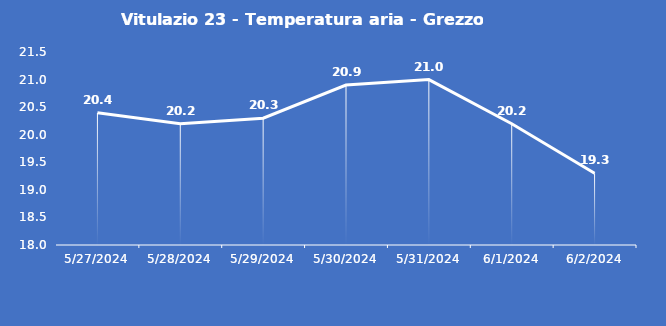
| Category | Vitulazio 23 - Temperatura aria - Grezzo (°C) |
|---|---|
| 5/27/24 | 20.4 |
| 5/28/24 | 20.2 |
| 5/29/24 | 20.3 |
| 5/30/24 | 20.9 |
| 5/31/24 | 21 |
| 6/1/24 | 20.2 |
| 6/2/24 | 19.3 |